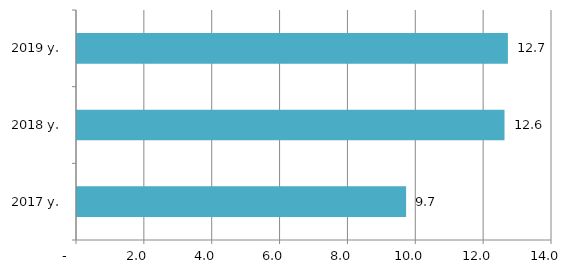
| Category | Series 0 |
|---|---|
| 2017 y. | 9.7 |
| 2018 y. | 12.6 |
| 2019 y. | 12.7 |